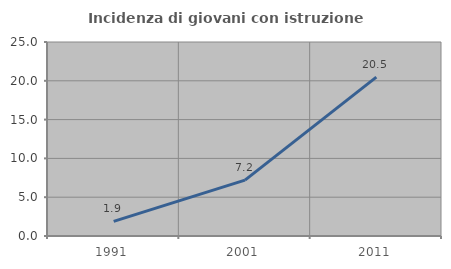
| Category | Incidenza di giovani con istruzione universitaria |
|---|---|
| 1991.0 | 1.887 |
| 2001.0 | 7.2 |
| 2011.0 | 20.482 |